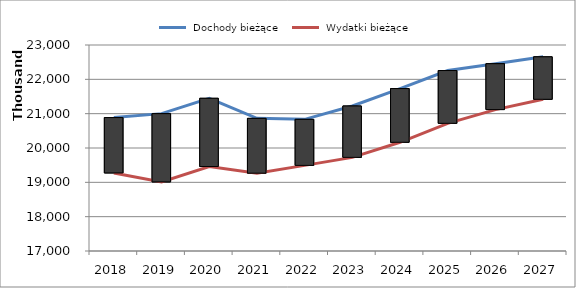
| Category |  Dochody bieżące |  Wydatki bieżące |
|---|---|---|
| 2018.0 | 20886080 | 19273202 |
| 2019.0 | 21000748 | 19012170 |
| 2020.0 | 21447811 | 19460149 |
| 2021.0 | 20863045 | 19266564 |
| 2022.0 | 20834936 | 19493510 |
| 2023.0 | 21223984 | 19727425 |
| 2024.0 | 21730704 | 20166759 |
| 2025.0 | 22255625 | 20718971 |
| 2026.0 | 22455625 | 21118971 |
| 2027.0 | 22655625 | 21418971 |